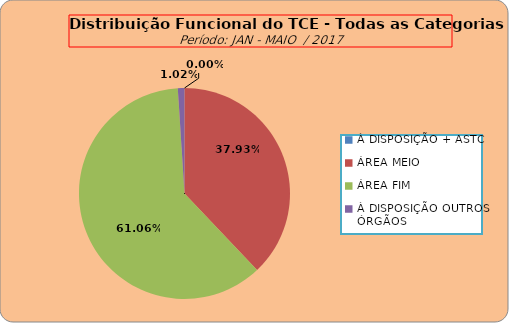
| Category | Series 0 |
|---|---|
| À DISPOSIÇÃO + ASTC | 0 |
| ÁREA MEIO | 187 |
| ÁREA FIM | 301 |
| À DISPOSIÇÃO OUTROS ÓRGÃOS | 5 |